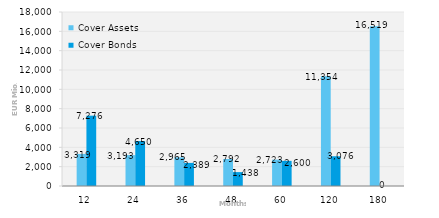
| Category | Cover Assets | Cover Bonds |
|---|---|---|
| 12.0 | 3319.399 | 7275.833 |
| 24.0 | 3192.977 | 4650 |
| 36.0 | 2965.066 | 2389.444 |
| 48.0 | 2791.961 | 1438 |
| 60.0 | 2723.322 | 2600 |
| 120.0 | 11353.551 | 3076.41 |
| 180.0 | 16519.082 | 0 |